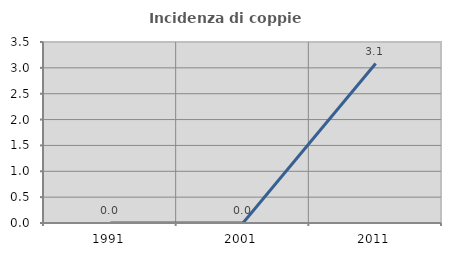
| Category | Incidenza di coppie miste |
|---|---|
| 1991.0 | 0 |
| 2001.0 | 0 |
| 2011.0 | 3.084 |